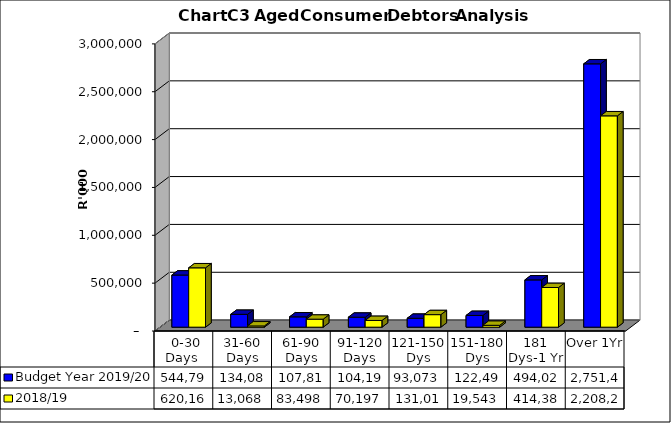
| Category | Budget Year 2019/20 | 2018/19 |
|---|---|---|
|  0-30 Days  | 544796088.13 | 620166130 |
| 31-60 Days | 134082105.61 | 13068120 |
| 61-90 Days | 107816829.06 | 83497768 |
| 91-120 Days | 104195684.89 | 70197107 |
| 121-150 Dys | 93072838.6 | 131018947 |
| 151-180 Dys | 122498073.3 | 19543355 |
| 181 Dys-1 Yr | 494026774.62 | 414385957 |
| Over 1Yr | 2751479564.26 | 2208223072 |